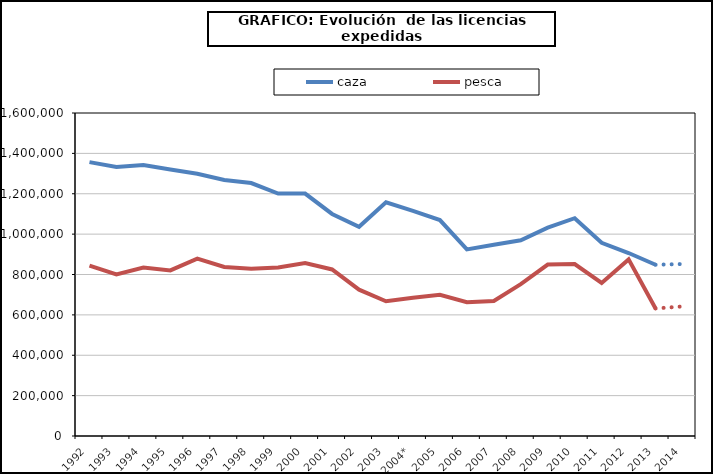
| Category | caza | pesca |
|---|---|---|
| 1992 | 1356553 | 844299 |
| 1993 | 1332252 | 799990 |
| 1994 | 1342603 | 834085 |
| 1995 | 1320315 | 820252 |
| 1996 | 1298860 | 878282 |
| 1997 | 1268057 | 837092 |
| 1998 | 1253105 | 829083 |
| 1999 | 1200951 | 834680 |
| 2000 | 1200875 | 856450 |
| 2001 | 1099856 | 825020 |
| 2002 | 1036340 | 724800 |
| 2003 | 1157969 | 667655 |
| 2004* | 1115000 | 685000 |
| 2005 | 1069804 | 699078 |
| 2006 | 924524 | 663000 |
| 2007 | 946965 | 668685 |
| 2008 | 969298 | 751937 |
| 2009 | 1032242 | 849102 |
| 2010 | 1078852 | 851759 |
| 2011 | 957191 | 758018 |
| 2012 | 906437 | 874802 |
| 2013 | 848243 | 631643 |
| 2014 | 851894 | 641819 |